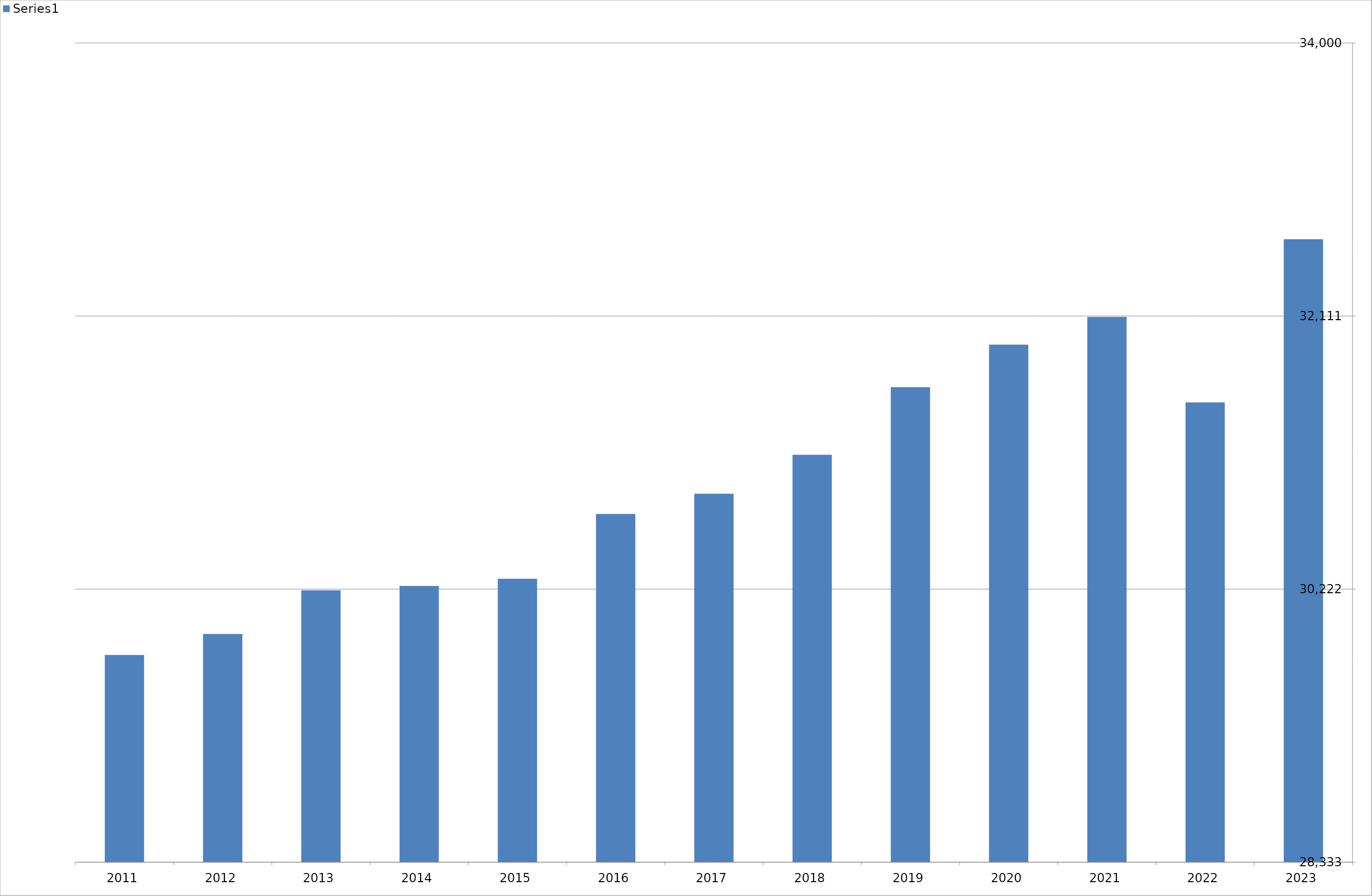
| Category | Series 1 |
|---|---|
| 2023 | 32643 |
| 2022 | 31514 |
| 2021 | 32105 |
| 2020 | 31914 |
| 2019 | 31619 |
| 2018 | 31152 |
| 2017 | 30882 |
| 2016 | 30742 |
| 2015 | 30294 |
| 2014 | 30244 |
| 2013 | 30214 |
| 2012 | 29912 |
| 2011 | 29767 |